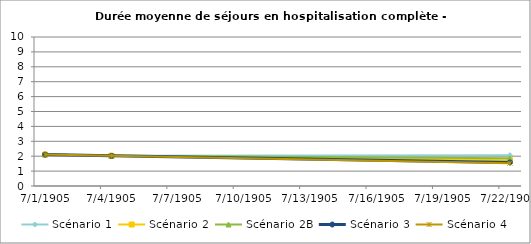
| Category | Scénario 1 | Scénario 2 | Scénario 2B | Scénario 3 | Scénario 4 |
|---|---|---|---|---|---|
| 2009.0 | 2.11 | 2.11 | 2.11 | 2.11 | 2.11 |
| 2012.0 | 2.027 | 2.027 | 2.027 | 2.027 | 2.027 |
| 2030.0 | 2.072 | 1.735 | 1.86 | 1.581 | 1.533 |